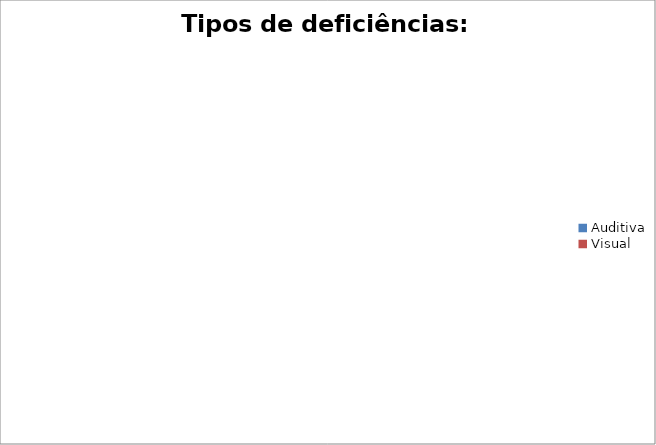
| Category | Tipos de deficiências: Quantitativo |
|---|---|
| Auditiva | 0 |
| Visual | 0 |